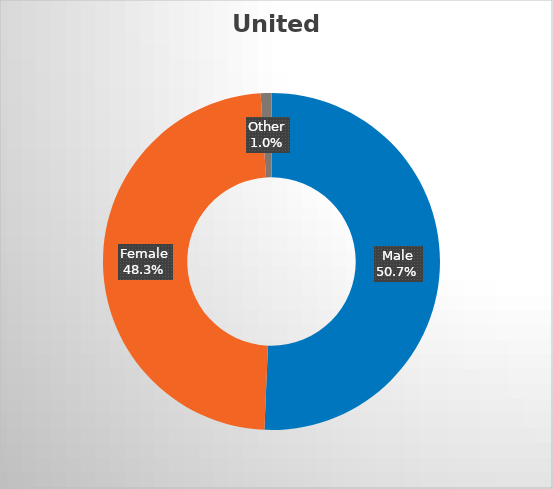
| Category | United States  |
|---|---|
| Male | 0.507 |
| Female | 0.483 |
| Other | 0.01 |